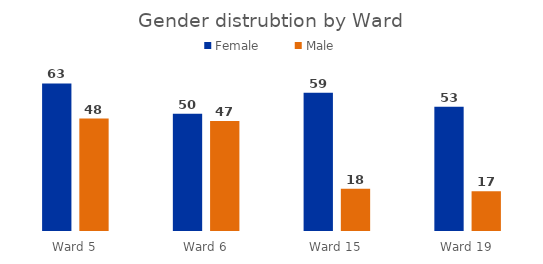
| Category | Female | Male |
|---|---|---|
| Ward 5 | 63 | 48 |
| Ward 6 | 50 | 47 |
| Ward 15 | 59 | 18 |
| Ward 19 | 53 | 17 |